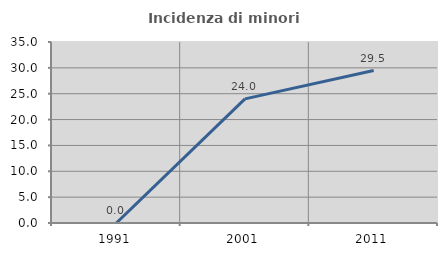
| Category | Incidenza di minori stranieri |
|---|---|
| 1991.0 | 0 |
| 2001.0 | 24 |
| 2011.0 | 29.487 |